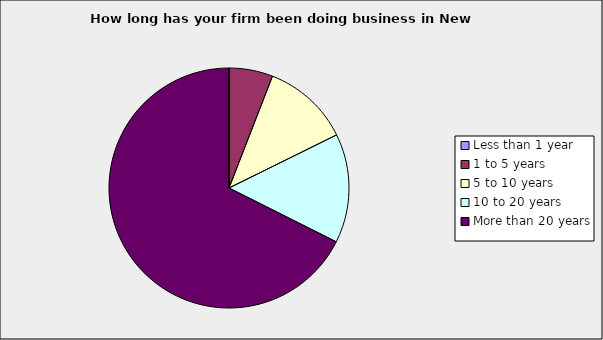
| Category | Series 0 |
|---|---|
| Less than 1 year | 0 |
| 1 to 5 years | 0.059 |
| 5 to 10 years | 0.118 |
| 10 to 20 years | 0.147 |
| More than 20 years | 0.676 |